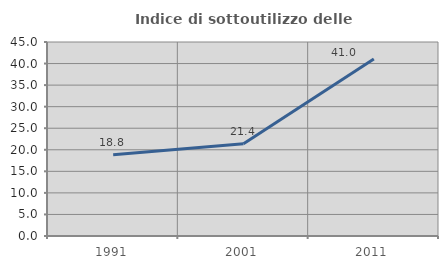
| Category | Indice di sottoutilizzo delle abitazioni  |
|---|---|
| 1991.0 | 18.828 |
| 2001.0 | 21.412 |
| 2011.0 | 41.039 |